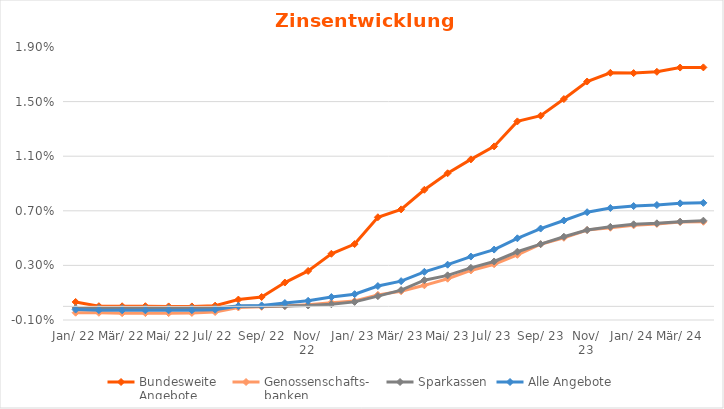
| Category | Bundesweite
Angebote | Genossenschafts-
banken | Sparkassen | Alle Angebote |
|---|---|---|---|---|
| Jan. 22 | 0 | 0 | 0 | 0 |
| Feb. 22 | 0 | 0 | 0 | 0 |
| Mrz. 22 | 0 | -0.001 | 0 | 0 |
| Apr. 22 | 0 | 0 | 0 | 0 |
| Mai. 22 | 0 | 0 | 0 | 0 |
| Jun. 22 | 0 | 0 | 0 | 0 |
| Jul. 22 | 0 | 0 | 0 | 0 |
| Aug. 22 | 0 | 0 | 0 | 0 |
| Sep. 22 | 0.001 | 0 | 0 | 0 |
| Okt. 22 | 0.002 | 0 | 0 | 0 |
| Nov. 22 | 0.003 | 0 | 0 | 0 |
| Dez. 22 | 0.004 | 0 | 0 | 0.001 |
| Jan. 23 | 0.005 | 0 | 0 | 0.001 |
| Feb. 23 | 0.007 | 0.001 | 0.001 | 0.001 |
| Mrz. 23 | 0.007 | 0.001 | 0.001 | 0.002 |
| Apr. 23 | 0.009 | 0.002 | 0.002 | 0.003 |
| Mai. 23 | 0.01 | 0.002 | 0.002 | 0.003 |
| Jun. 23 | 0.011 | 0.003 | 0.003 | 0.004 |
| Jul. 23 | 0.012 | 0.003 | 0.003 | 0.004 |
| Aug. 23 | 0.014 | 0.004 | 0.004 | 0.005 |
| Sep. 23 | 0.014 | 0.005 | 0.005 | 0.006 |
| Okt. 23 | 0.015 | 0.005 | 0.005 | 0.006 |
| Nov. 23 | 0.016 | 0.006 | 0.006 | 0.007 |
| Dez. 23 | 0.017 | 0.006 | 0.006 | 0.007 |
| Jan. 24 | 0.017 | 0.006 | 0.006 | 0.007 |
| Feb. 24 | 0.017 | 0.006 | 0.006 | 0.007 |
| Mrz. 24 | 0.017 | 0.006 | 0.006 | 0.008 |
| Akt. | 0.018 | 0.006 | 0.006 | 0.008 |